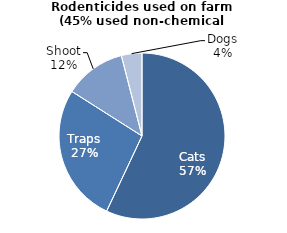
| Category | Series 0 |
|---|---|
| Cats | 57 |
| Traps | 27 |
| Shoot | 12 |
| Dogs | 4 |